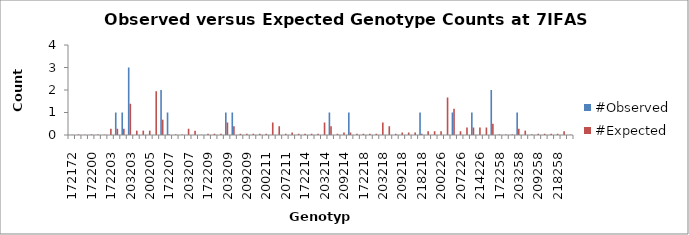
| Category | #Observed | #Expected |
|---|---|---|
| 172172.0 | 0 | 0.014 |
| 172184.0 | 0 | 0.028 |
| 184184.0 | 0 | 0.014 |
| 172200.0 | 0 | 0.028 |
| 184200.0 | 0 | 0.028 |
| 200200.0 | 0 | 0.014 |
| 172203.0 | 0 | 0.278 |
| 184203.0 | 1 | 0.278 |
| 200203.0 | 1 | 0.278 |
| 203203.0 | 3 | 1.389 |
| 172205.0 | 0 | 0.194 |
| 184205.0 | 0 | 0.194 |
| 200205.0 | 0 | 0.194 |
| 203205.0 | 0 | 1.944 |
| 205205.0 | 2 | 0.681 |
| 172207.0 | 1 | 0.028 |
| 184207.0 | 0 | 0.028 |
| 200207.0 | 0 | 0.028 |
| 203207.0 | 0 | 0.278 |
| 205207.0 | 0 | 0.194 |
| 207207.0 | 0 | 0.014 |
| 172209.0 | 0 | 0.056 |
| 184209.0 | 0 | 0.056 |
| 200209.0 | 0 | 0.056 |
| 203209.0 | 1 | 0.556 |
| 205209.0 | 1 | 0.389 |
| 207209.0 | 0 | 0.056 |
| 209209.0 | 0 | 0.056 |
| 172211.0 | 0 | 0.056 |
| 184211.0 | 0 | 0.056 |
| 200211.0 | 0 | 0.056 |
| 203211.0 | 0 | 0.556 |
| 205211.0 | 0 | 0.389 |
| 207211.0 | 0 | 0.056 |
| 209211.0 | 0 | 0.111 |
| 211211.0 | 0 | 0.056 |
| 172214.0 | 0 | 0.056 |
| 184214.0 | 0 | 0.056 |
| 200214.0 | 0 | 0.056 |
| 203214.0 | 0 | 0.556 |
| 205214.0 | 1 | 0.389 |
| 207214.0 | 0 | 0.056 |
| 209214.0 | 0 | 0.111 |
| 211214.0 | 1 | 0.111 |
| 214214.0 | 0 | 0.056 |
| 172218.0 | 0 | 0.056 |
| 184218.0 | 0 | 0.056 |
| 200218.0 | 0 | 0.056 |
| 203218.0 | 0 | 0.556 |
| 205218.0 | 0 | 0.389 |
| 207218.0 | 0 | 0.056 |
| 209218.0 | 0 | 0.111 |
| 211218.0 | 0 | 0.111 |
| 214218.0 | 0 | 0.111 |
| 218218.0 | 1 | 0.056 |
| 172226.0 | 0 | 0.167 |
| 184226.0 | 0 | 0.167 |
| 200226.0 | 0 | 0.167 |
| 203226.0 | 0 | 1.667 |
| 205226.0 | 1 | 1.167 |
| 207226.0 | 0 | 0.167 |
| 209226.0 | 0 | 0.333 |
| 211226.0 | 1 | 0.333 |
| 214226.0 | 0 | 0.333 |
| 218226.0 | 0 | 0.333 |
| 226226.0 | 2 | 0.5 |
| 172258.0 | 0 | 0.028 |
| 184258.0 | 0 | 0.028 |
| 200258.0 | 0 | 0.028 |
| 203258.0 | 1 | 0.278 |
| 205258.0 | 0 | 0.194 |
| 207258.0 | 0 | 0.028 |
| 209258.0 | 0 | 0.056 |
| 211258.0 | 0 | 0.056 |
| 214258.0 | 0 | 0.056 |
| 218258.0 | 0 | 0.056 |
| 226258.0 | 0 | 0.167 |
| 258258.0 | 0 | 0.014 |